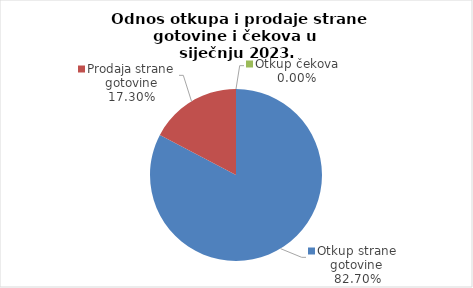
| Category | Series 0 |
|---|---|
| Otkup strane gotovine | 82.705 |
| Prodaja strane gotovine | 17.295 |
| Otkup čekova | 0 |